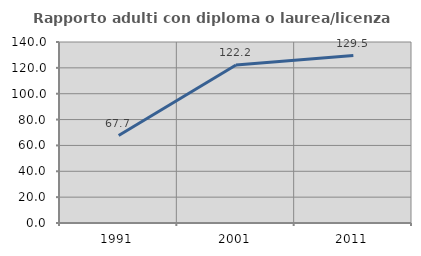
| Category | Rapporto adulti con diploma o laurea/licenza media  |
|---|---|
| 1991.0 | 67.67 |
| 2001.0 | 122.171 |
| 2011.0 | 129.471 |